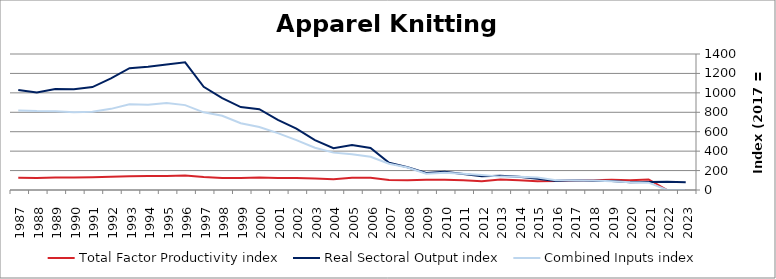
| Category | Total Factor Productivity index | Real Sectoral Output index | Combined Inputs index |
|---|---|---|---|
| 2023.0 | 0 | 79.948 | 0 |
| 2022.0 | 0 | 85.186 | 0 |
| 2021.0 | 109.078 | 82.703 | 75.82 |
| 2020.0 | 101.027 | 79.935 | 79.122 |
| 2019.0 | 104.392 | 93.585 | 89.647 |
| 2018.0 | 99.251 | 96.397 | 97.125 |
| 2017.0 | 100 | 100 | 100 |
| 2016.0 | 92.462 | 93.95 | 101.609 |
| 2015.0 | 90.009 | 115.047 | 127.817 |
| 2014.0 | 99.561 | 135.513 | 136.111 |
| 2013.0 | 107.209 | 147.615 | 137.689 |
| 2012.0 | 91.209 | 140.43 | 153.965 |
| 2011.0 | 99.638 | 165.766 | 166.369 |
| 2010.0 | 106.625 | 188.811 | 177.079 |
| 2009.0 | 105.305 | 175.837 | 166.978 |
| 2008.0 | 101.073 | 234.216 | 231.729 |
| 2007.0 | 103.378 | 280.155 | 270.999 |
| 2006.0 | 126.688 | 433.496 | 342.176 |
| 2005.0 | 125.51 | 462.586 | 368.564 |
| 2004.0 | 111.699 | 429.782 | 384.769 |
| 2003.0 | 118.181 | 513.882 | 434.826 |
| 2002.0 | 123.081 | 631.645 | 513.195 |
| 2001.0 | 123.361 | 721.899 | 585.192 |
| 2000.0 | 128.242 | 832.222 | 648.947 |
| 1999.0 | 124.257 | 854.122 | 687.382 |
| 1998.0 | 123.788 | 946.635 | 764.725 |
| 1997.0 | 132.818 | 1061.902 | 799.517 |
| 1996.0 | 150.365 | 1313.958 | 873.847 |
| 1995.0 | 144.38 | 1291.372 | 894.428 |
| 1994.0 | 144.535 | 1268.983 | 877.976 |
| 1993.0 | 142.191 | 1253.852 | 881.807 |
| 1992.0 | 137.589 | 1149.413 | 835.399 |
| 1991.0 | 131.624 | 1059.963 | 805.294 |
| 1990.0 | 129.409 | 1036.038 | 800.594 |
| 1989.0 | 128.081 | 1039.622 | 811.69 |
| 1988.0 | 123.487 | 1002.793 | 812.066 |
| 1987.0 | 126.042 | 1030.398 | 817.506 |